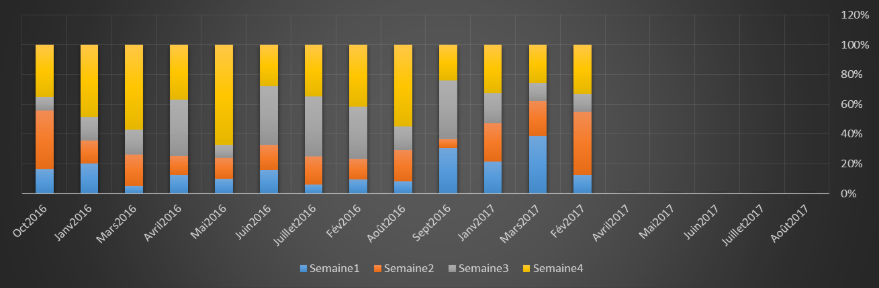
| Category | Semaine1 | Semaine2 | Semaine3 | Semaine4 |
|---|---|---|---|---|
| Oct2016 | 0.162 | 0.398 | 0.087 | 0.354 |
| Janv2016 | 0.203 | 0.153 | 0.159 | 0.485 |
| Mars2016 | 0.053 | 0.211 | 0.165 | 0.572 |
| Avril2016 | 0.126 | 0.127 | 0.377 | 0.37 |
| Mai2016 | 0.1 | 0.139 | 0.085 | 0.676 |
| Juin2016 | 0.158 | 0.169 | 0.393 | 0.279 |
| Juillet2016 | 0.058 | 0.192 | 0.404 | 0.346 |
| Fév2016 | 0.094 | 0.138 | 0.35 | 0.417 |
| Août2016 | 0.082 | 0.209 | 0.161 | 0.548 |
| Sept2016 | 0.306 | 0.058 | 0.396 | 0.239 |
| Janv2017 | 0.216 | 0.256 | 0.201 | 0.327 |
| Mars2017 | 0.386 | 0.237 | 0.121 | 0.257 |
| Fév2017 | 0.124 | 0.426 | 0.118 | 0.332 |
| Avril2017 | 0 | 0 | 0 | 0 |
| Mai2017 | 0 | 0 | 0 | 0 |
| Juin2017 | 0 | 0 | 0 | 0 |
| Juillet2017 | 0 | 0 | 0 | 0 |
| Août2017 | 0 | 0 | 0 | 0 |